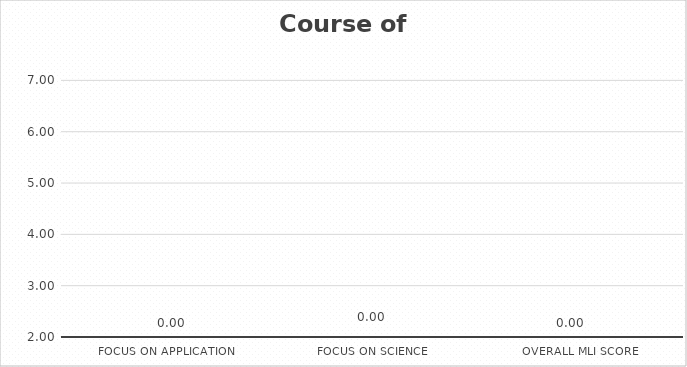
| Category | Series 2 |
|---|---|
| Focus on application | 0 |
| Focus on science | 0 |
| Overall MLI score | 0 |